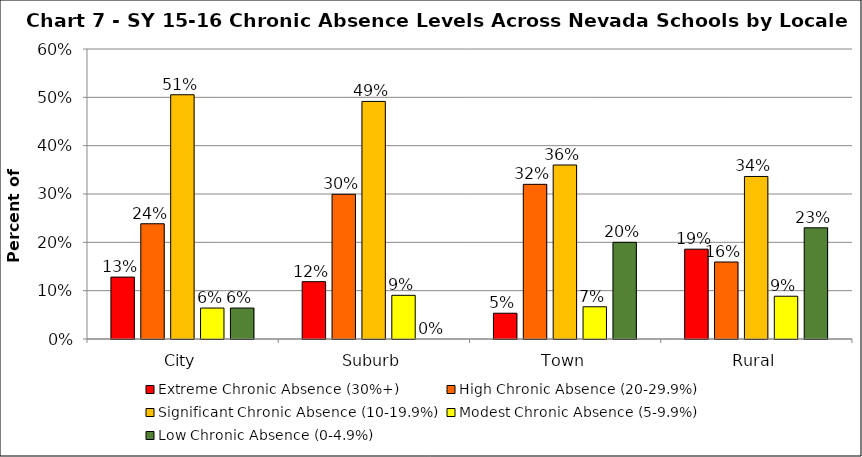
| Category | Extreme Chronic Absence (30%+) | High Chronic Absence (20-29.9%) | Significant Chronic Absence (10-19.9%) | Modest Chronic Absence (5-9.9%) | Low Chronic Absence (0-4.9%) |
|---|---|---|---|---|---|
| 0 | 0.128 | 0.238 | 0.505 | 0.064 | 0.064 |
| 1 | 0.119 | 0.299 | 0.492 | 0.09 | 0 |
| 2 | 0.053 | 0.32 | 0.36 | 0.067 | 0.2 |
| 3 | 0.186 | 0.159 | 0.336 | 0.088 | 0.23 |